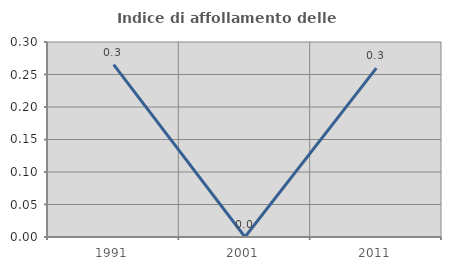
| Category | Indice di affollamento delle abitazioni  |
|---|---|
| 1991.0 | 0.265 |
| 2001.0 | 0 |
| 2011.0 | 0.26 |